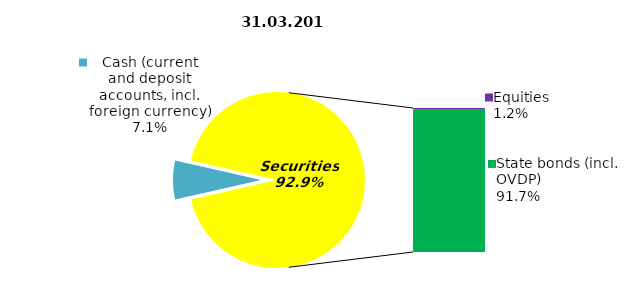
| Category | Series 0 |
|---|---|
| Cash (current and deposit accounts, incl. foreign currency) | 7.553 |
| Bank metals | 0 |
| Real estate | 0 |
| Other Assets | 0 |
| Equities | 1.274 |
| Corporate bonds | 0 |
| Municipal bonds | 0 |
| State bonds (incl. OVDP) | 97.727 |
| Mortgage certificates | 0 |